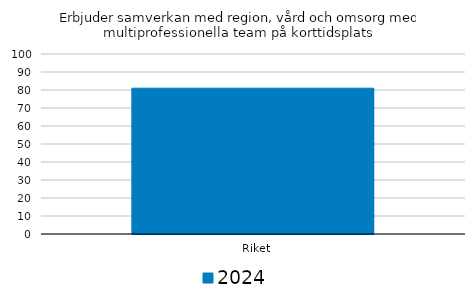
| Category | 2024 |
|---|---|
|   Riket | 81 |